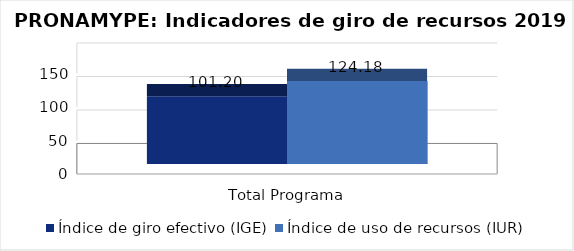
| Category | Índice de giro efectivo (IGE) | Índice de uso de recursos (IUR)  |
|---|---|---|
| Total Programa | 101.195 | 124.18 |